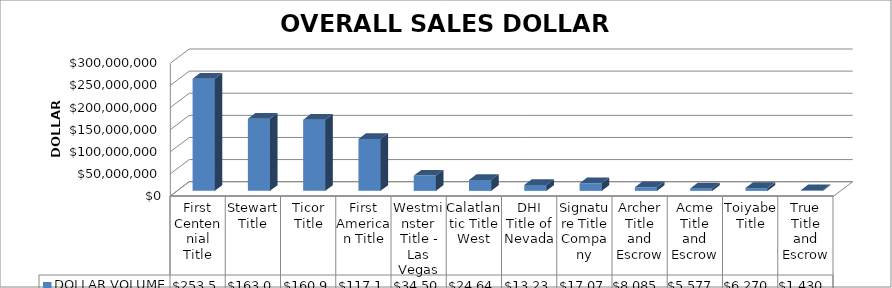
| Category | DOLLAR VOLUME |
|---|---|
| First Centennial Title | 253574447.74 |
| Stewart Title | 163008359.9 |
| Ticor Title | 160920672 |
| First American Title | 117176932 |
| Westminster Title - Las Vegas | 34500169 |
| Calatlantic Title West | 24645921 |
| DHI Title of Nevada | 13235210 |
| Signature Title Company | 17078677 |
| Archer Title and Escrow | 8085050 |
| Acme Title and Escrow | 5577000 |
| Toiyabe Title | 6270400 |
| True Title and Escrow | 1430000 |